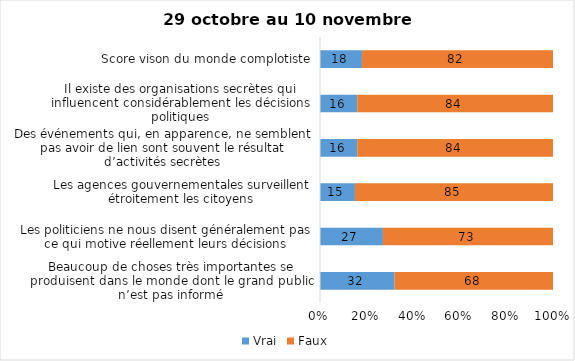
| Category | Vrai | Faux |
|---|---|---|
| Beaucoup de choses très importantes se produisent dans le monde dont le grand public n’est pas informé | 32 | 68 |
| Les politiciens ne nous disent généralement pas ce qui motive réellement leurs décisions | 27 | 73 |
| Les agences gouvernementales surveillent étroitement les citoyens | 15 | 85 |
| Des événements qui, en apparence, ne semblent pas avoir de lien sont souvent le résultat d’activités secrètes | 16 | 84 |
| Il existe des organisations secrètes qui influencent considérablement les décisions politiques | 16 | 84 |
| Score vison du monde complotiste | 18 | 82 |